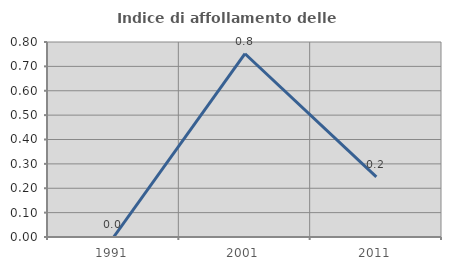
| Category | Indice di affollamento delle abitazioni  |
|---|---|
| 1991.0 | 0 |
| 2001.0 | 0.752 |
| 2011.0 | 0.247 |